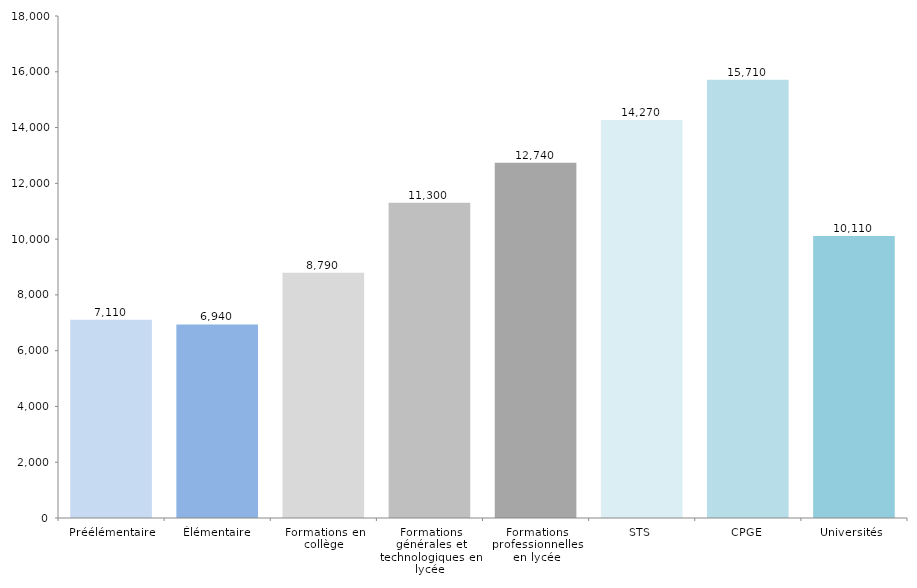
| Category | Series 0 |
|---|---|
| Préélémentaire | 7110 |
| Élémentaire | 6940 |
| Formations en collège | 8790 |
| Formations générales et technologiques en lycée | 11300 |
| Formations professionnelles en lycée | 12740 |
| STS | 14270 |
| CPGE | 15710 |
| Universités  | 10110 |